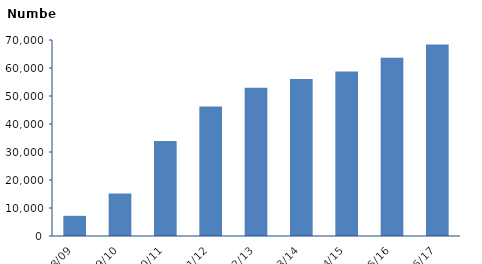
| Category | Clients seen |
|---|---|
| 2008/09 | 7203 |
| 2009/10 | 15171 |
| 2010/11 | 33891 |
| 2011/12 | 46212 |
| 2012/13 | 52920 |
| 2013/14 | 56091 |
| 2014/15 | 58715 |
| 2015/16 | 63682 |
| 2016/17 | 68387 |